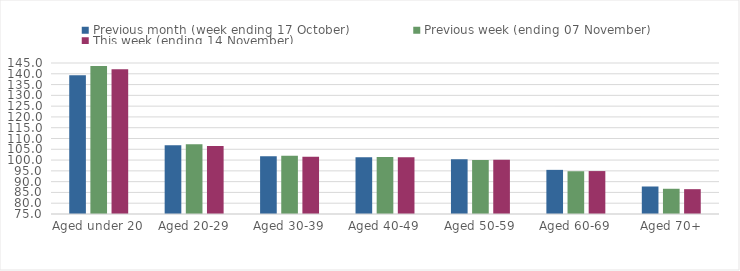
| Category | Previous month (week ending 17 October) | Previous week (ending 07 November) | This week (ending 14 November) |
|---|---|---|---|
| Aged under 20 | 139.34 | 143.57 | 142.07 |
| Aged 20-29 | 106.87 | 107.36 | 106.58 |
| Aged 30-39 | 101.81 | 101.96 | 101.55 |
| Aged 40-49 | 101.36 | 101.42 | 101.36 |
| Aged 50-59 | 100.33 | 100.08 | 100.11 |
| Aged 60-69 | 95.46 | 94.82 | 94.9 |
| Aged 70+ | 87.75 | 86.7 | 86.51 |